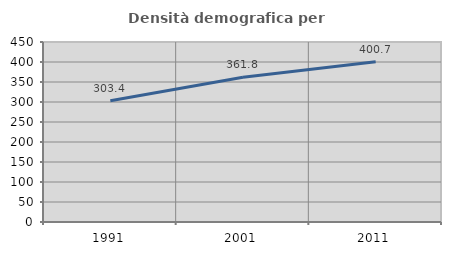
| Category | Densità demografica |
|---|---|
| 1991.0 | 303.362 |
| 2001.0 | 361.822 |
| 2011.0 | 400.712 |